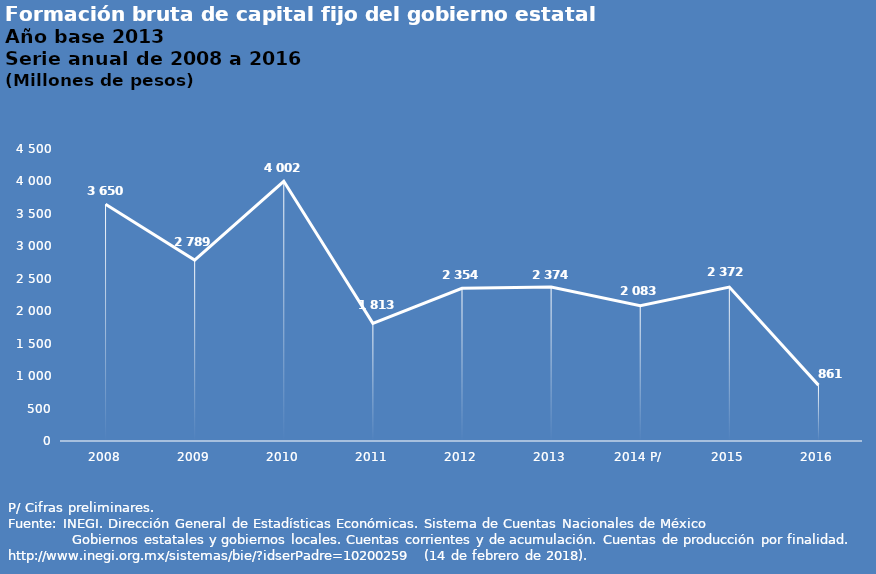
| Category | Series 0 |
|---|---|
| 2008 | 3650 |
| 2009 | 2789 |
| 2010 | 4002 |
| 2011 | 1813 |
| 2012 | 2354 |
| 2013 | 2374 |
| 2014 P/ | 2083 |
| 2015 | 2372 |
| 2016 | 861 |